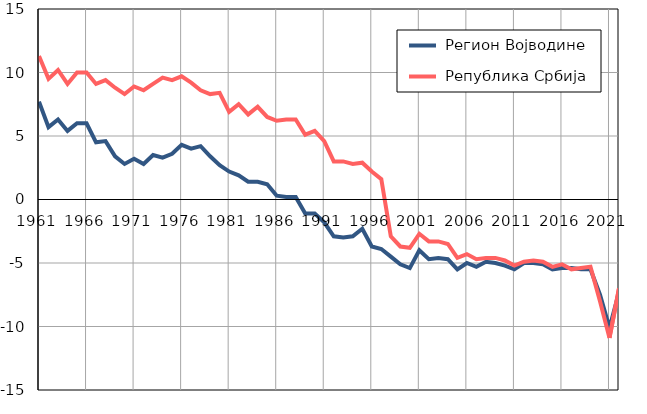
| Category |  Регион Војводине |  Република Србија |
|---|---|---|
| 1961.0 | 7.7 | 11.3 |
| 1962.0 | 5.7 | 9.5 |
| 1963.0 | 6.3 | 10.2 |
| 1964.0 | 5.4 | 9.1 |
| 1965.0 | 6 | 10 |
| 1966.0 | 6 | 10 |
| 1967.0 | 4.5 | 9.1 |
| 1968.0 | 4.6 | 9.4 |
| 1969.0 | 3.4 | 8.8 |
| 1970.0 | 2.8 | 8.3 |
| 1971.0 | 3.2 | 8.9 |
| 1972.0 | 2.8 | 8.6 |
| 1973.0 | 3.5 | 9.1 |
| 1974.0 | 3.3 | 9.6 |
| 1975.0 | 3.6 | 9.4 |
| 1976.0 | 4.3 | 9.7 |
| 1977.0 | 4 | 9.2 |
| 1978.0 | 4.2 | 8.6 |
| 1979.0 | 3.4 | 8.3 |
| 1980.0 | 2.7 | 8.4 |
| 1981.0 | 2.2 | 6.9 |
| 1982.0 | 1.9 | 7.5 |
| 1983.0 | 1.4 | 6.7 |
| 1984.0 | 1.4 | 7.3 |
| 1985.0 | 1.2 | 6.5 |
| 1986.0 | 0.3 | 6.2 |
| 1987.0 | 0.2 | 6.3 |
| 1988.0 | 0.2 | 6.3 |
| 1989.0 | -1.1 | 5.1 |
| 1990.0 | -1.1 | 5.4 |
| 1991.0 | -1.8 | 4.6 |
| 1992.0 | -2.9 | 3 |
| 1993.0 | -3 | 3 |
| 1994.0 | -2.9 | 2.8 |
| 1995.0 | -2.3 | 2.9 |
| 1996.0 | -3.7 | 2.2 |
| 1997.0 | -3.9 | 1.6 |
| 1998.0 | -4.5 | -2.9 |
| 1999.0 | -5.1 | -3.7 |
| 2000.0 | -5.4 | -3.8 |
| 2001.0 | -4 | -2.7 |
| 2002.0 | -4.7 | -3.3 |
| 2003.0 | -4.6 | -3.3 |
| 2004.0 | -4.7 | -3.5 |
| 2005.0 | -5.5 | -4.6 |
| 2006.0 | -5 | -4.3 |
| 2007.0 | -5.3 | -4.7 |
| 2008.0 | -4.9 | -4.6 |
| 2009.0 | -5 | -4.6 |
| 2010.0 | -5.2 | -4.8 |
| 2011.0 | -5.5 | -5.2 |
| 2012.0 | -5 | -4.9 |
| 2013.0 | -5 | -4.8 |
| 2014.0 | -5.1 | -4.9 |
| 2015.0 | -5.5 | -5.3 |
| 2016.0 | -5.4 | -5.1 |
| 2017.0 | -5.4 | -5.5 |
| 2018.0 | -5.5 | -5.4 |
| 2019.0 | -5.5 | -5.3 |
| 2020.0 | -7.5 | -8 |
| 2021.0 | -10.1 | -10.9 |
| 2022.0 | -7.3 | -7 |